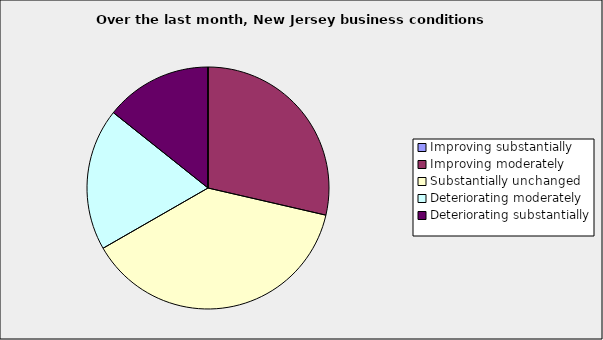
| Category | Series 0 |
|---|---|
| Improving substantially | 0 |
| Improving moderately | 0.286 |
| Substantially unchanged | 0.381 |
| Deteriorating moderately | 0.19 |
| Deteriorating substantially | 0.143 |